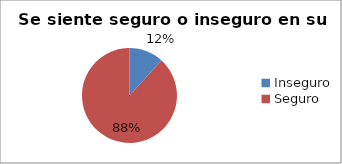
| Category | Series 0 |
|---|---|
| Inseguro | 0.118 |
| Seguro  | 0.882 |